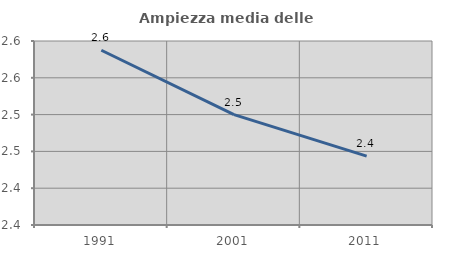
| Category | Ampiezza media delle famiglie |
|---|---|
| 1991.0 | 2.587 |
| 2001.0 | 2.5 |
| 2011.0 | 2.444 |